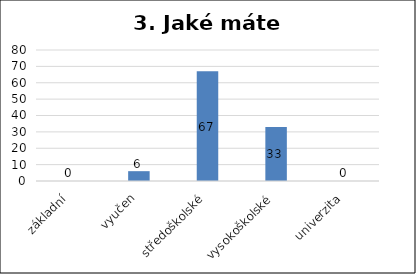
| Category | Series 0 |
|---|---|
| základní | 0 |
| vyučen | 6 |
| středoškolské | 67 |
| vysokoškolské | 33 |
| univerzita | 0 |